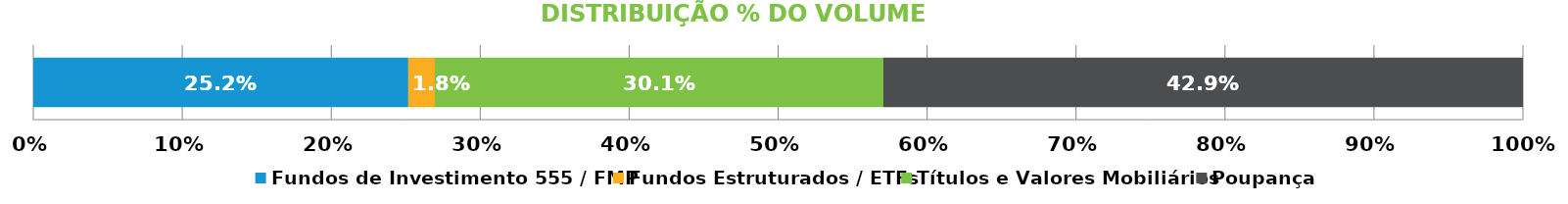
| Category | Fundos de Investimento 555 / FMP | Fundos Estruturados / ETFs | Títulos e Valores Mobiliários | Poupança |
|---|---|---|---|---|
| 0 | 0.252 | 0.018 | 0.301 | 0.429 |